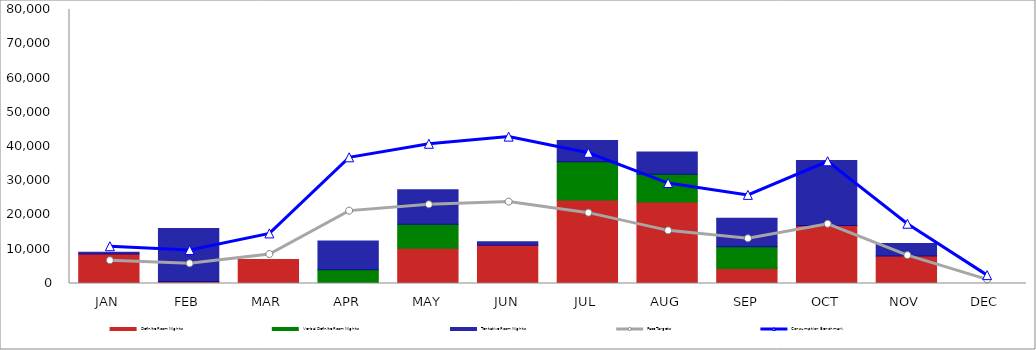
| Category | Definite Room Nights | Verbal Definite Room Nights | Tentative Room Nights |
|---|---|---|---|
| JAN | 8643 | 0 | 481 |
| FEB | 598 | 0 | 15483 |
| MAR | 7030 | 0 | 0 |
| APR | 0 | 4000 | 8402 |
| MAY | 10290 | 7030 | 10025 |
| JUN | 11200 | 0 | 1023 |
| JUL | 24369 | 11160 | 6210 |
| AUG | 23774 | 8095 | 6530 |
| SEP | 4354 | 6400 | 8265 |
| OCT | 16919 | 0 | 19021 |
| NOV | 8012 | 0 | 3654 |
| DEC | 0 | 0 | 0 |